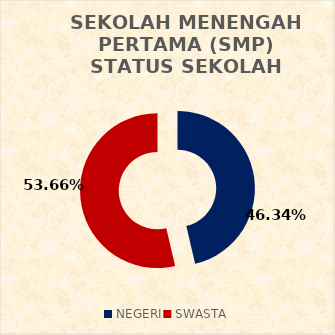
| Category | SEKOLAH MENENGAH PERTAMA (SMP) STATUS SEKOLAH |
|---|---|
| NEGERI | 38 |
| SWASTA | 44 |